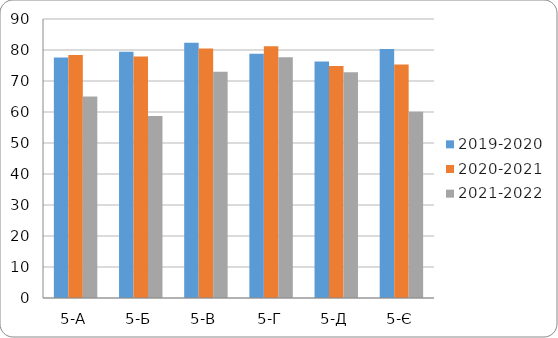
| Category | 2019-2020 | 2020-2021 | 2021-2022 |
|---|---|---|---|
| 5-А | 77.6 | 78.4 | 65 |
| 5-Б | 79.4 | 77.9 | 58.7 |
| 5-В | 82.3 | 80.5 | 73 |
| 5-Г | 78.8 | 81.2 | 77.7 |
| 5-Д | 76.3 | 74.8 | 72.8 |
| 5-Є | 80.3 | 75.3 | 60.1 |